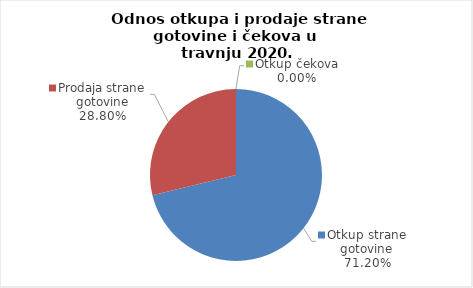
| Category | Series 0 |
|---|---|
| Otkup strane gotovine | 71.195 |
| Prodaja strane gotovine | 28.805 |
| Otkup čekova | 0 |